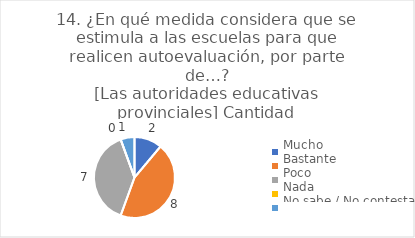
| Category | 14. ¿En qué medida considera que se estimula a las escuelas para que realicen autoevaluación, por parte de…?
[Las autoridades educativas provinciales] |
|---|---|
| Mucho  | 0.111 |
| Bastante  | 0.444 |
| Poco  | 0.389 |
| Nada  | 0 |
| No sabe / No contesta | 0.056 |